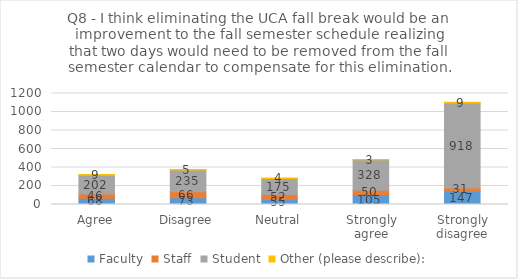
| Category | Faculty | Staff | Student | Other (please describe): |
|---|---|---|---|---|
| Agree | 68 | 46 | 202 | 9 |
| Disagree | 73 | 66 | 235 | 5 |
| Neutral | 55 | 52 | 175 | 4 |
| Strongly agree | 105 | 50 | 328 | 3 |
| Strongly disagree | 147 | 31 | 918 | 9 |